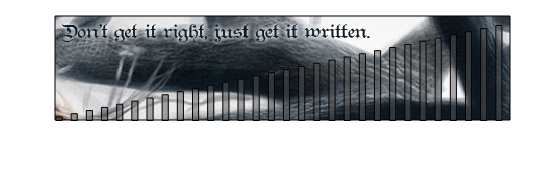
| Category | Series 0 | Series 1 |
|---|---|---|
| 0 | 1666.667 | 0 |
| 1 | 3333.333 | 0 |
| 2 | 5000 | 0 |
| 3 | 6666.667 | 0 |
| 4 | 8333.333 | 0 |
| 5 | 10000 | 0 |
| 6 | 11666.667 | 0 |
| 7 | 13333.333 | 0 |
| 8 | 15000 | 0 |
| 9 | 16666.667 | 0 |
| 10 | 18333.333 | 0 |
| 11 | 20000 | 0 |
| 12 | 21666.667 | 0 |
| 13 | 23333.333 | 0 |
| 14 | 25000 | 0 |
| 15 | 26666.667 | 0 |
| 16 | 28333.333 | 0 |
| 17 | 30000 | 0 |
| 18 | 31666.667 | 0 |
| 19 | 33333.333 | 0 |
| 20 | 35000 | 0 |
| 21 | 36666.667 | 0 |
| 22 | 38333.333 | 0 |
| 23 | 40000 | 0 |
| 24 | 41666.667 | 0 |
| 25 | 43333.333 | 0 |
| 26 | 45000 | 0 |
| 27 | 46666.667 | 0 |
| 28 | 48333.333 | 0 |
| 29 | 50000 | 0 |